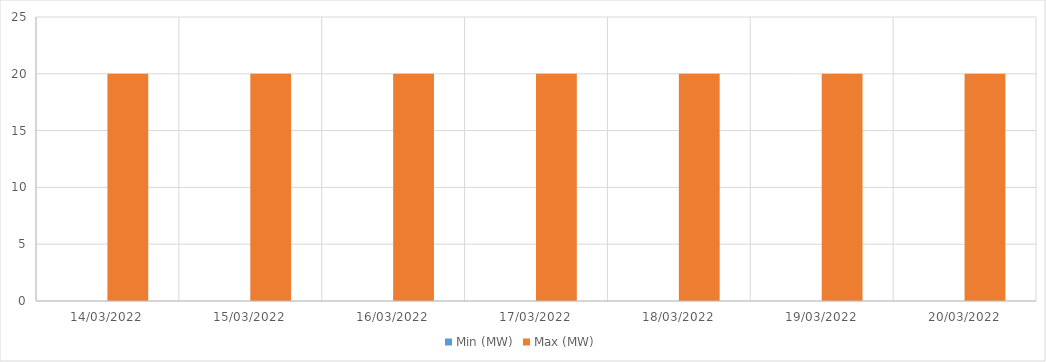
| Category | Min (MW) | Max (MW) |
|---|---|---|
| 14/03/2022 | 0 | 20 |
| 15/03/2022 | 0 | 20 |
| 16/03/2022 | 0 | 20 |
| 17/03/2022 | 0 | 20 |
| 18/03/2022 | 0 | 20 |
| 19/03/2022 | 0 | 20 |
| 20/03/2022 | 0 | 20 |